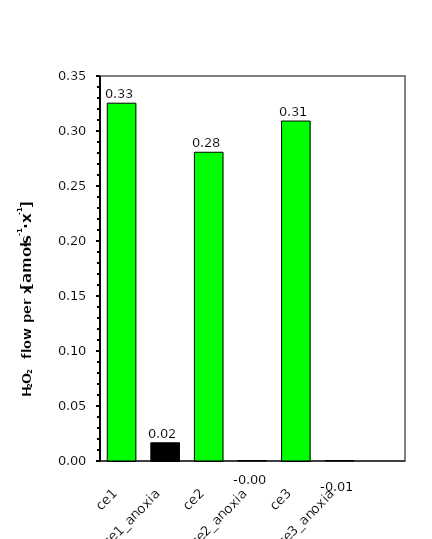
| Category | H2O2 flow per x |
|---|---|
| ce1 | 0.325 |
| ce1_anoxia | 0.017 |
| ce2 | 0.281 |
| ce2_anoxia | -0.005 |
| ce3 | 0.309 |
| ce3_anoxia | -0.011 |